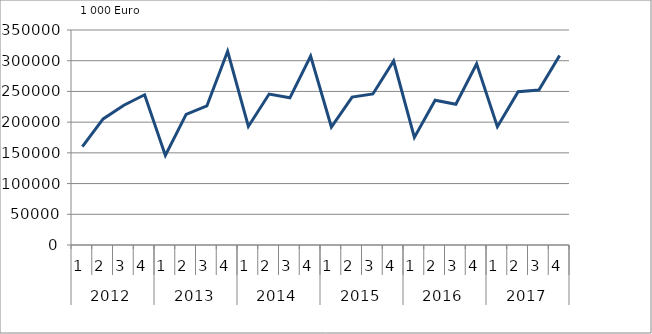
| Category | Ausbaugewerblicher Umsatz3 |
|---|---|
| 0 | 160065 |
| 1 | 205323 |
| 2 | 227469 |
| 3 | 244537 |
| 4 | 145792.596 |
| 5 | 212577 |
| 6 | 226327.748 |
| 7 | 315433.896 |
| 8 | 193004.858 |
| 9 | 245754.159 |
| 10 | 239547.85 |
| 11 | 307688.935 |
| 12 | 192043.756 |
| 13 | 240826.879 |
| 14 | 245916.087 |
| 15 | 299455.378 |
| 16 | 175225.59 |
| 17 | 235781.631 |
| 18 | 229227.559 |
| 19 | 294992.157 |
| 20 | 192499.539 |
| 21 | 249394.388 |
| 22 | 252146.755 |
| 23 | 308653.153 |